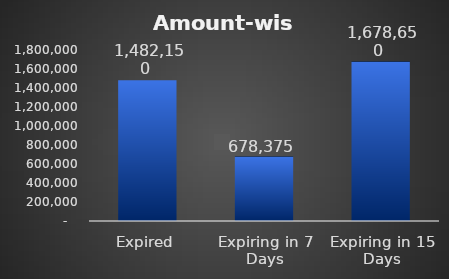
| Category | Series 0 |
|---|---|
| Expired | 1482150 |
| Expiring in 7 Days | 678375 |
| Expiring in 15 Days | 1678650 |